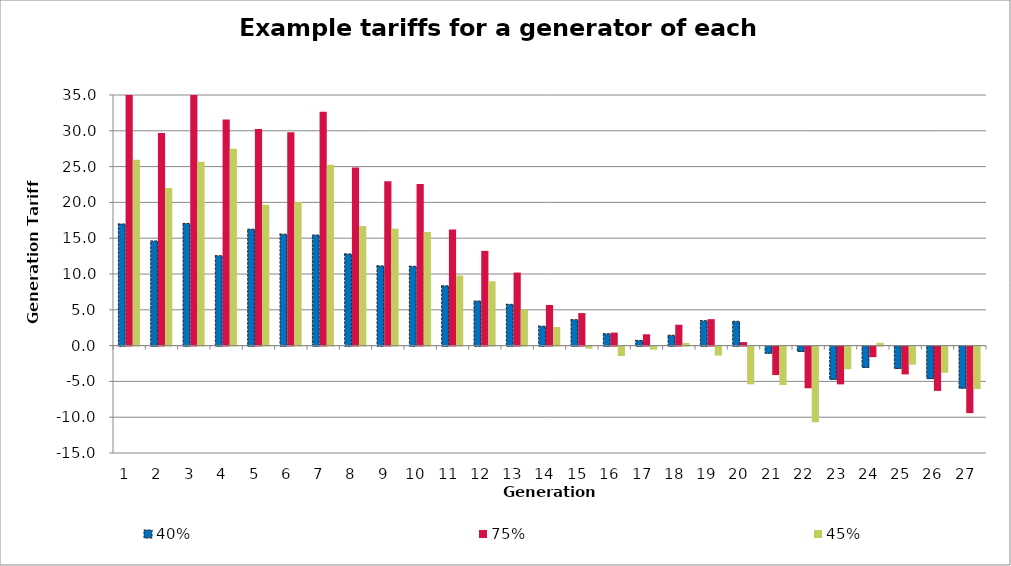
| Category | 40% | 75% | 45% |
|---|---|---|---|
| 1.0 | 16.985 | 35.126 | 25.966 |
| 2.0 | 14.616 | 29.688 | 22.02 |
| 3.0 | 17.054 | 35.007 | 25.685 |
| 4.0 | 12.552 | 31.58 | 27.478 |
| 5.0 | 16.263 | 30.235 | 19.658 |
| 6.0 | 15.565 | 29.801 | 20.067 |
| 7.0 | 15.447 | 32.649 | 25.261 |
| 8.0 | 12.804 | 24.862 | 16.688 |
| 9.0 | 11.132 | 22.957 | 16.336 |
| 10.0 | 11.077 | 22.584 | 15.867 |
| 11.0 | 8.346 | 16.205 | 9.788 |
| 12.0 | 6.226 | 13.232 | 8.988 |
| 13.0 | 5.764 | 10.203 | 5.059 |
| 14.0 | 2.711 | 5.669 | 2.59 |
| 15.0 | 3.619 | 4.538 | -0.27 |
| 16.0 | 1.654 | 1.818 | -1.318 |
| 17.0 | 0.72 | 1.583 | -0.42 |
| 18.0 | 1.446 | 2.918 | 0.364 |
| 19.0 | 3.478 | 3.693 | -1.253 |
| 20.0 | 3.393 | 0.486 | -5.268 |
| 21.0 | -0.994 | -3.979 | -5.366 |
| 22.0 | -0.742 | -5.821 | -10.566 |
| 23.0 | -4.641 | -5.274 | -3.154 |
| 24.0 | -2.968 | -1.471 | 0.395 |
| 25.0 | -3.114 | -3.885 | -2.521 |
| 26.0 | -4.533 | -6.185 | -3.653 |
| 27.0 | -5.87 | -9.293 | -5.93 |